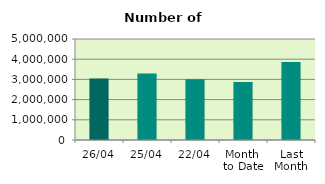
| Category | Series 0 |
|---|---|
| 26/04 | 3044148 |
| 25/04 | 3291414 |
| 22/04 | 3008180 |
| Month 
to Date | 2872624.75 |
| Last
Month | 3862771.739 |